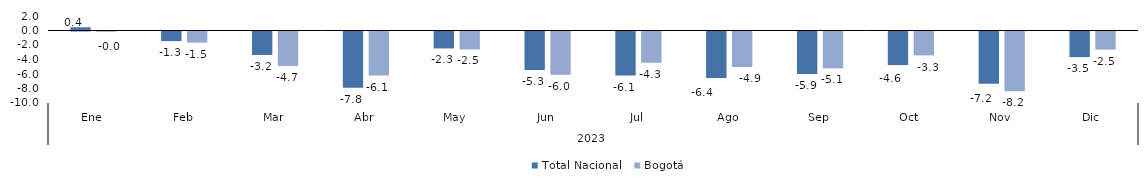
| Category | Total Nacional | Bogotá |
|---|---|---|
| 0 | 0.446 | -0.036 |
| 1 | -1.324 | -1.54 |
| 2 | -3.237 | -4.748 |
| 3 | -7.775 | -6.083 |
| 4 | -2.337 | -2.47 |
| 5 | -5.318 | -5.973 |
| 6 | -6.073 | -4.311 |
| 7 | -6.43 | -4.898 |
| 8 | -5.851 | -5.089 |
| 9 | -4.634 | -3.298 |
| 10 | -7.218 | -8.228 |
| 11 | -3.533 | -2.492 |